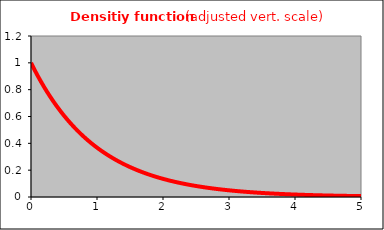
| Category | Series 0 |
|---|---|
| 0.0 | 1 |
| 0.05 | 0.951 |
| 0.1 | 0.905 |
| 0.15 | 0.861 |
| 0.2 | 0.819 |
| 0.25 | 0.779 |
| 0.3 | 0.741 |
| 0.35 | 0.705 |
| 0.4 | 0.67 |
| 0.45 | 0.638 |
| 0.5 | 0.607 |
| 0.55 | 0.577 |
| 0.6 | 0.549 |
| 0.65 | 0.522 |
| 0.7 | 0.497 |
| 0.75 | 0.472 |
| 0.8 | 0.449 |
| 0.85 | 0.427 |
| 0.9 | 0.407 |
| 0.95 | 0.387 |
| 1.0 | 0.368 |
| 1.05 | 0.35 |
| 1.1 | 0.333 |
| 1.15 | 0.317 |
| 1.2 | 0.301 |
| 1.25 | 0.287 |
| 1.3 | 0.273 |
| 1.35 | 0.259 |
| 1.4 | 0.247 |
| 1.45 | 0.235 |
| 1.5 | 0.223 |
| 1.55 | 0.212 |
| 1.6 | 0.202 |
| 1.65 | 0.192 |
| 1.7 | 0.183 |
| 1.75 | 0.174 |
| 1.8 | 0.165 |
| 1.85 | 0.157 |
| 1.9 | 0.15 |
| 1.95 | 0.142 |
| 2.0 | 0.135 |
| 2.05 | 0.129 |
| 2.1 | 0.122 |
| 2.15 | 0.116 |
| 2.2 | 0.111 |
| 2.25 | 0.105 |
| 2.3 | 0.1 |
| 2.35 | 0.095 |
| 2.4 | 0.091 |
| 2.45 | 0.086 |
| 2.5 | 0.082 |
| 2.55 | 0.078 |
| 2.6 | 0.074 |
| 2.65 | 0.071 |
| 2.7 | 0.067 |
| 2.75 | 0.064 |
| 2.8 | 0.061 |
| 2.85 | 0.058 |
| 2.9 | 0.055 |
| 2.95 | 0.052 |
| 3.0 | 0.05 |
| 3.05 | 0.047 |
| 3.1 | 0.045 |
| 3.15 | 0.043 |
| 3.2 | 0.041 |
| 3.25 | 0.039 |
| 3.3 | 0.037 |
| 3.35 | 0.035 |
| 3.4 | 0.033 |
| 3.45 | 0.032 |
| 3.5 | 0.03 |
| 3.55 | 0.029 |
| 3.6 | 0.027 |
| 3.65 | 0.026 |
| 3.7 | 0.025 |
| 3.75 | 0.024 |
| 3.8 | 0.022 |
| 3.85 | 0.021 |
| 3.9 | 0.02 |
| 3.95 | 0.019 |
| 4.0 | 0.018 |
| 4.05 | 0.017 |
| 4.1 | 0.017 |
| 4.15 | 0.016 |
| 4.2 | 0.015 |
| 4.25 | 0.014 |
| 4.3 | 0.014 |
| 4.35 | 0.013 |
| 4.4 | 0.012 |
| 4.45 | 0.012 |
| 4.5 | 0.011 |
| 4.55 | 0.011 |
| 4.6 | 0.01 |
| 4.65 | 0.01 |
| 4.7 | 0.009 |
| 4.75 | 0.009 |
| 4.8 | 0.008 |
| 4.85 | 0.008 |
| 4.9 | 0.007 |
| 4.95 | 0.007 |
| 5.0 | 0.007 |
| 5.05 | 0.006 |
| 5.1 | 0.006 |
| 5.15 | 0.006 |
| 5.2 | 0.006 |
| 5.25 | 0.005 |
| 5.3 | 0.005 |
| 5.35 | 0.005 |
| 5.4 | 0.005 |
| 5.45 | 0.004 |
| 5.5 | 0.004 |
| 5.55 | 0.004 |
| 5.6 | 0.004 |
| 5.65 | 0.004 |
| 5.7 | 0.003 |
| 5.75 | 0.003 |
| 5.8 | 0.003 |
| 5.85 | 0.003 |
| 5.9 | 0.003 |
| 5.95 | 0.003 |
| 6.0 | 0.002 |
| 6.05 | 0.002 |
| 6.1 | 0.002 |
| 6.15 | 0.002 |
| 6.2 | 0.002 |
| 6.25 | 0.002 |
| 6.3 | 0.002 |
| 6.35 | 0.002 |
| 6.4 | 0.002 |
| 6.45 | 0.002 |
| 6.5 | 0.002 |
| 6.55 | 0.001 |
| 6.6 | 0.001 |
| 6.65 | 0.001 |
| 6.7 | 0.001 |
| 6.75 | 0.001 |
| 6.8 | 0.001 |
| 6.85 | 0.001 |
| 6.9 | 0.001 |
| 6.95 | 0.001 |
| 7.0 | 0.001 |
| 7.05 | 0.001 |
| 7.1 | 0.001 |
| 7.15 | 0.001 |
| 7.2 | 0.001 |
| 7.25 | 0.001 |
| 7.3 | 0.001 |
| 7.35 | 0.001 |
| 7.4 | 0.001 |
| 7.45 | 0.001 |
| 7.5 | 0.001 |
| 7.55 | 0.001 |
| 7.6 | 0.001 |
| 7.65 | 0 |
| 7.7 | 0 |
| 7.75 | 0 |
| 7.8 | 0 |
| 7.85 | 0 |
| 7.9 | 0 |
| 7.95 | 0 |
| 8.0 | 0 |
| 8.05 | 0 |
| 8.1 | 0 |
| 8.15 | 0 |
| 8.2 | 0 |
| 8.25 | 0 |
| 8.3 | 0 |
| 8.35 | 0 |
| 8.4 | 0 |
| 8.45 | 0 |
| 8.5 | 0 |
| 8.55 | 0 |
| 8.6 | 0 |
| 8.65 | 0 |
| 8.7 | 0 |
| 8.75 | 0 |
| 8.8 | 0 |
| 8.85 | 0 |
| 8.9 | 0 |
| 8.95 | 0 |
| 9.0 | 0 |
| 9.05 | 0 |
| 9.1 | 0 |
| 9.15 | 0 |
| 9.2 | 0 |
| 9.25 | 0 |
| 9.3 | 0 |
| 9.35 | 0 |
| 9.4 | 0 |
| 9.45 | 0 |
| 9.5 | 0 |
| 9.55 | 0 |
| 9.6 | 0 |
| 9.65 | 0 |
| 9.7 | 0 |
| 9.75 | 0 |
| 9.8 | 0 |
| 9.85 | 0 |
| 9.9 | 0 |
| 9.95 | 0 |
| 10.0 | 0 |